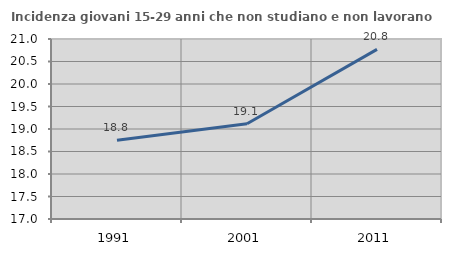
| Category | Incidenza giovani 15-29 anni che non studiano e non lavorano  |
|---|---|
| 1991.0 | 18.75 |
| 2001.0 | 19.118 |
| 2011.0 | 20.769 |